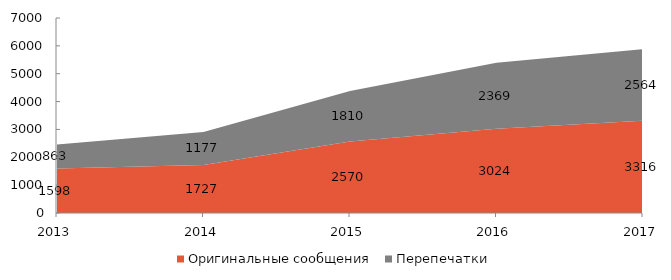
| Category | Оригинальные сообщения | Перепечатки |
|---|---|---|
| 2013 | 1598 | 863 |
| 2014 | 1727 | 1177 |
| 2015 | 2570 | 1810 |
| 2016 | 3024 | 2369 |
| 2017 | 3316 | 2564 |